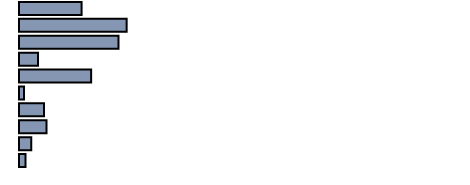
| Category | Series 0 |
|---|---|
| 0 | 14.322 |
| 1 | 24.631 |
| 2 | 22.766 |
| 3 | 4.329 |
| 4 | 16.508 |
| 5 | 1.13 |
| 6 | 5.747 |
| 7 | 6.294 |
| 8 | 2.804 |
| 9 | 1.469 |